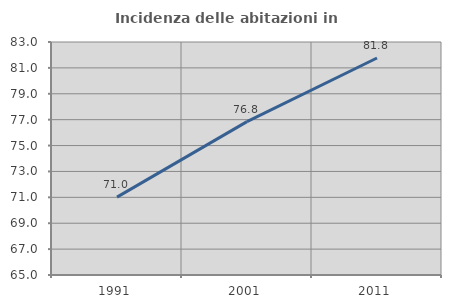
| Category | Incidenza delle abitazioni in proprietà  |
|---|---|
| 1991.0 | 71.013 |
| 2001.0 | 76.849 |
| 2011.0 | 81.766 |